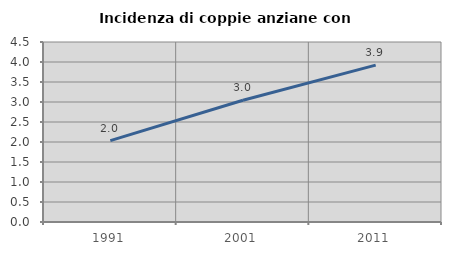
| Category | Incidenza di coppie anziane con figli |
|---|---|
| 1991.0 | 2.035 |
| 2001.0 | 3.045 |
| 2011.0 | 3.922 |